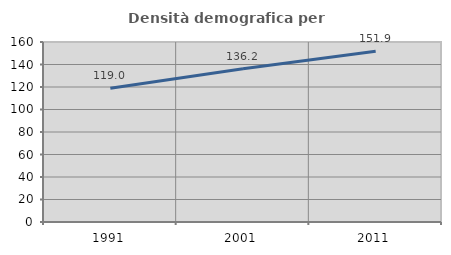
| Category | Densità demografica |
|---|---|
| 1991.0 | 118.977 |
| 2001.0 | 136.154 |
| 2011.0 | 151.875 |